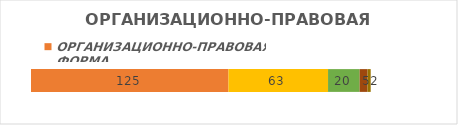
| Category | ООО | ИП | АО | Другие | ОАО |
|---|---|---|---|---|---|
| Итог | 125 | 63 | 20 | 5 | 2 |